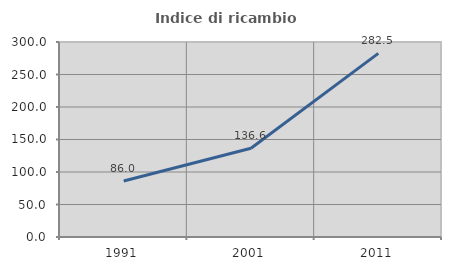
| Category | Indice di ricambio occupazionale  |
|---|---|
| 1991.0 | 86.047 |
| 2001.0 | 136.641 |
| 2011.0 | 282.5 |